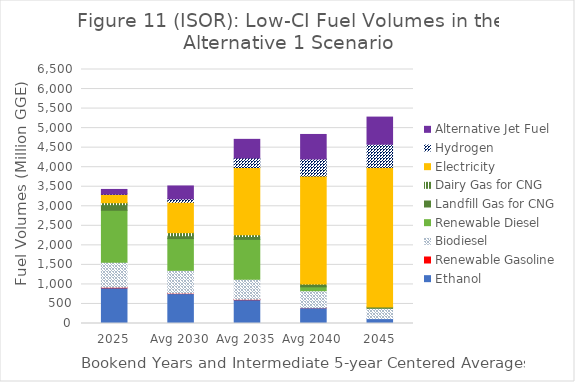
| Category | Ethanol | Renewable Gasoline | Biodiesel | Renewable Diesel | Landfill Gas for CNG | Dairy Gas for CNG | Electricity | Hydrogen | Alternative Jet Fuel |
|---|---|---|---|---|---|---|---|---|---|
| 2025 | 913.355 | 12.959 | 644.244 | 1326.709 | 144.467 | 49.404 | 213.013 | 5.314 | 120.981 |
| Avg 2030 | 765.54 | 7.936 | 586.649 | 812.473 | 73.799 | 78.374 | 777.105 | 87.448 | 330.564 |
| Avg 2035 | 608.043 | 9.978 | 512.807 | 1021.532 | 73.799 | 42.77 | 1722.918 | 241.867 | 478.761 |
| Avg 2040 | 404.539 | 0.97 | 433.271 | 99.261 | 67.655 | 5.281 | 2762.485 | 436.496 | 627.587 |
| 2045 | 124.439 | 0 | 264.17 | 0 | 32.937 | 0 | 3572.892 | 592.954 | 694.722 |